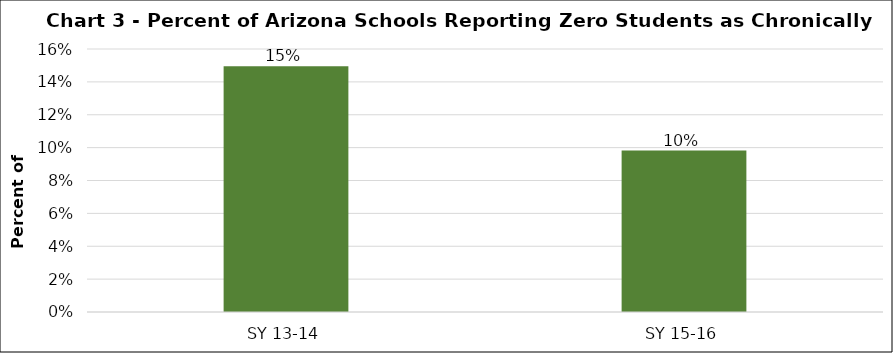
| Category | Series 0 |
|---|---|
| SY 13-14 | 0.15 |
| SY 15-16 | 0.098 |